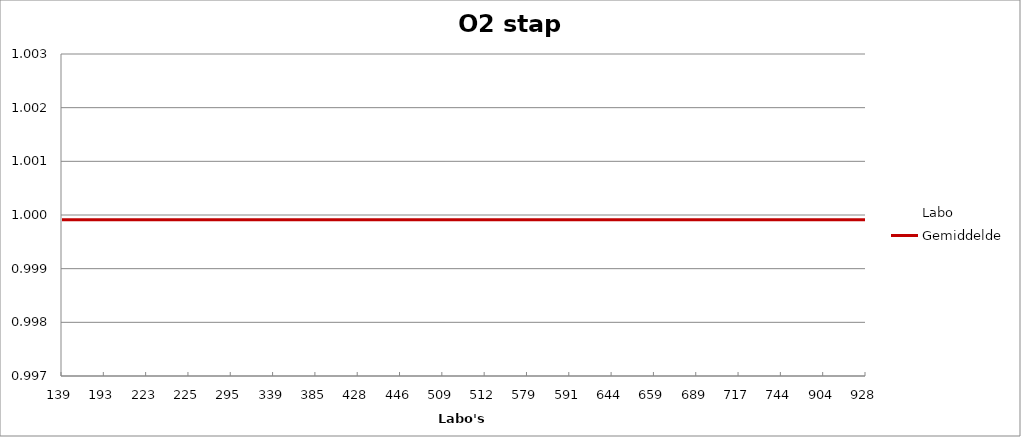
| Category | Labo | Gemiddelde |
|---|---|---|
| 139.0 | 1.002 | 1 |
| 193.0 | 1 | 1 |
| 223.0 | 1 | 1 |
| 225.0 | 1 | 1 |
| 295.0 | 1 | 1 |
| 339.0 | 1 | 1 |
| 385.0 | 0.999 | 1 |
| 428.0 | 1 | 1 |
| 446.0 | 1 | 1 |
| 509.0 | 1 | 1 |
| 512.0 | 1 | 1 |
| 579.0 | 1 | 1 |
| 591.0 | 1.001 | 1 |
| 644.0 | 0.999 | 1 |
| 659.0 | 0.999 | 1 |
| 689.0 | 1 | 1 |
| 717.0 | 0.999 | 1 |
| 744.0 | 1 | 1 |
| 904.0 | 1 | 1 |
| 928.0 | 0.998 | 1 |